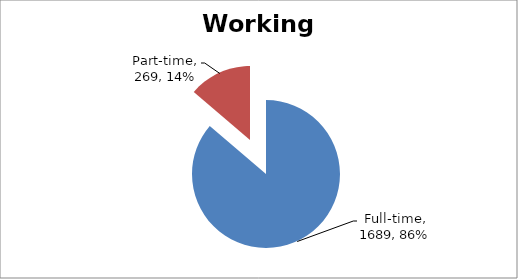
| Category | Series 0 |
|---|---|
| Full-time | 1689 |
| Part-time | 269 |